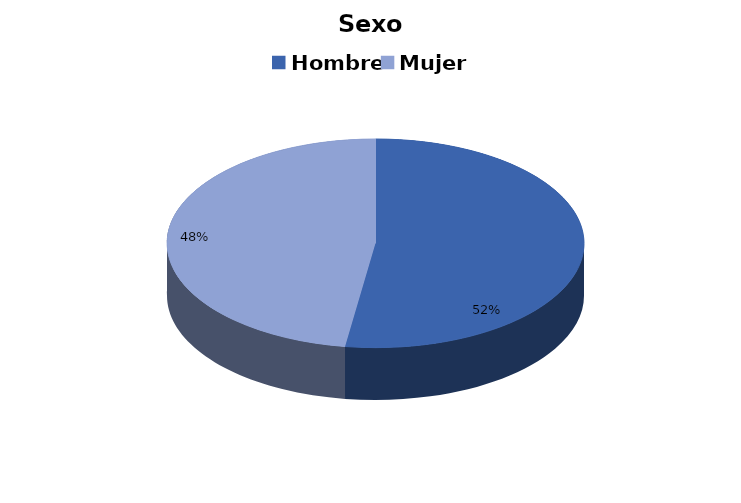
| Category | Sexo |
|---|---|
| Hombre | 101 |
| Mujer | 92 |